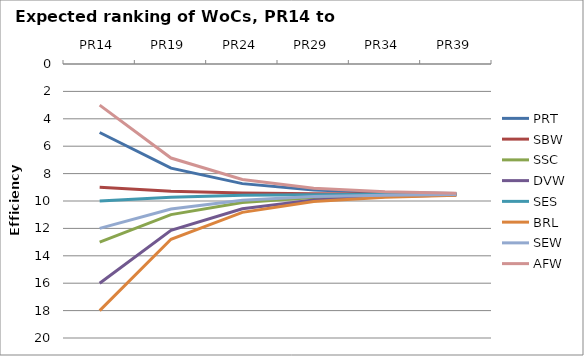
| Category | PRT | SBW | SSC | DVW | SES | BRL | SEW | AFW |
|---|---|---|---|---|---|---|---|---|
| PR14 | 5 | 9 | 13 | 16 | 10 | 18 | 12 | 3 |
| PR19 | 7.605 | 9.282 | 10.995 | 12.137 | 9.718 | 12.79 | 10.58 | 6.863 |
| PR24 | 8.732 | 9.411 | 10.106 | 10.567 | 9.589 | 10.829 | 9.938 | 8.433 |
| PR29 | 9.189 | 9.464 | 9.745 | 9.932 | 9.536 | 10.038 | 9.677 | 9.068 |
| PR34 | 9.374 | 9.485 | 9.599 | 9.675 | 9.515 | 9.718 | 9.572 | 9.325 |
| PR39 | 9.449 | 9.494 | 9.54 | 9.571 | 9.506 | 9.588 | 9.529 | 9.429 |